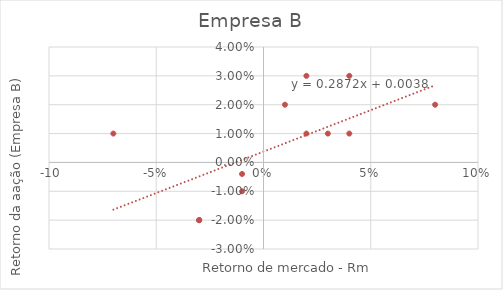
| Category | Rb |
|---|---|
| -0.01 | -0.004 |
| -0.03 | -0.02 |
| 0.02 | 0.01 |
| 0.04 | 0.03 |
| 0.03 | 0.01 |
| -0.01 | -0.01 |
| -0.03 | -0.02 |
| 0.02 | 0.03 |
| 0.08 | 0.02 |
| 0.01 | 0.02 |
| 0.04 | 0.01 |
| -0.03 | -0.02 |
| -0.07 | 0.01 |